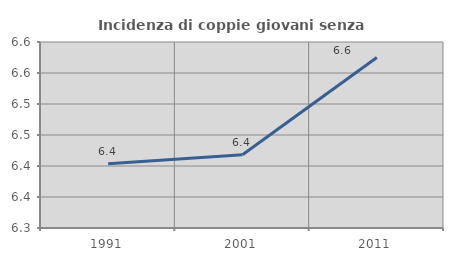
| Category | Incidenza di coppie giovani senza figli |
|---|---|
| 1991.0 | 6.404 |
| 2001.0 | 6.418 |
| 2011.0 | 6.575 |